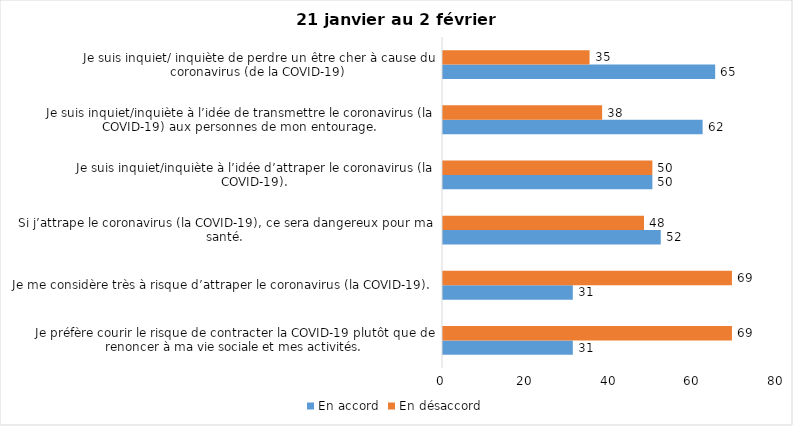
| Category | En accord | En désaccord |
|---|---|---|
| Je préfère courir le risque de contracter la COVID-19 plutôt que de renoncer à ma vie sociale et mes activités. | 31 | 69 |
| Je me considère très à risque d’attraper le coronavirus (la COVID-19). | 31 | 69 |
| Si j’attrape le coronavirus (la COVID-19), ce sera dangereux pour ma santé. | 52 | 48 |
| Je suis inquiet/inquiète à l’idée d’attraper le coronavirus (la COVID-19). | 50 | 50 |
| Je suis inquiet/inquiète à l’idée de transmettre le coronavirus (la COVID-19) aux personnes de mon entourage. | 62 | 38 |
| Je suis inquiet/ inquiète de perdre un être cher à cause du coronavirus (de la COVID-19) | 65 | 35 |